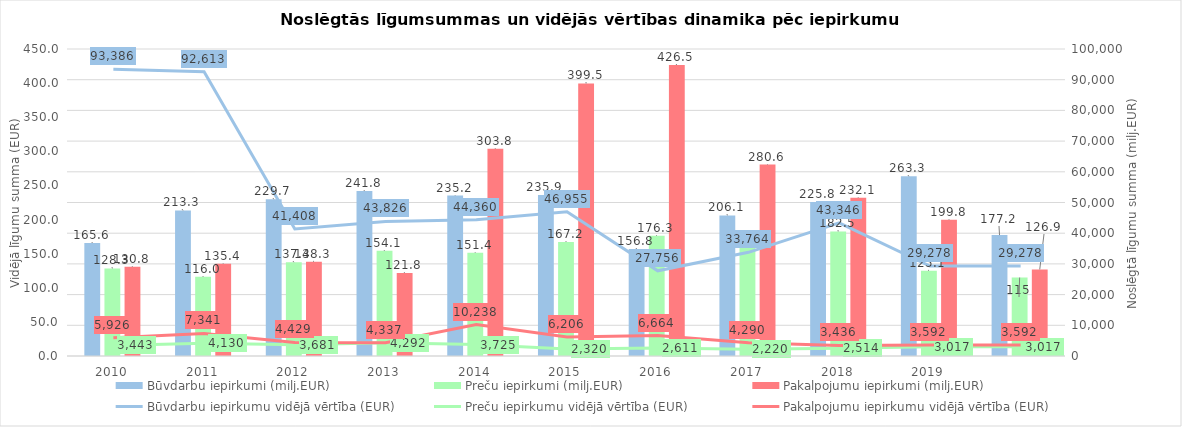
| Category | Būvdarbu iepirkumi (milj.EUR) | Preču iepirkumi (milj.EUR) | Pakalpojumu iepirkumi (milj.EUR) |
|---|---|---|---|
| 2010.0 | 165.6 | 128.3 | 130.8 |
| 2011.0 | 213.3 | 116 | 135.4 |
| 2012.0 | 229.7 | 137.4 | 138.3 |
| 2013.0 | 241.8 | 154.1 | 121.8 |
| 2014.0 | 235.2 | 151.4 | 303.8 |
| 2015.0 | 235.9 | 167.2 | 399.5 |
| 2016.0 | 156.8 | 176.3 | 426.5 |
| 2017.0 | 206.1 | 159.7 | 280.6 |
| 2018.0 | 225.8 | 182.5 | 232.1 |
| 2019.0 | 263.3 | 125.1 | 199.8 |
| 2020.0 | 177.2 | 115 | 126.9 |